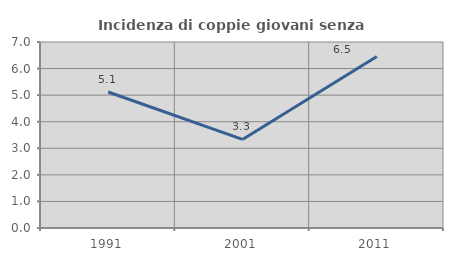
| Category | Incidenza di coppie giovani senza figli |
|---|---|
| 1991.0 | 5.118 |
| 2001.0 | 3.333 |
| 2011.0 | 6.452 |